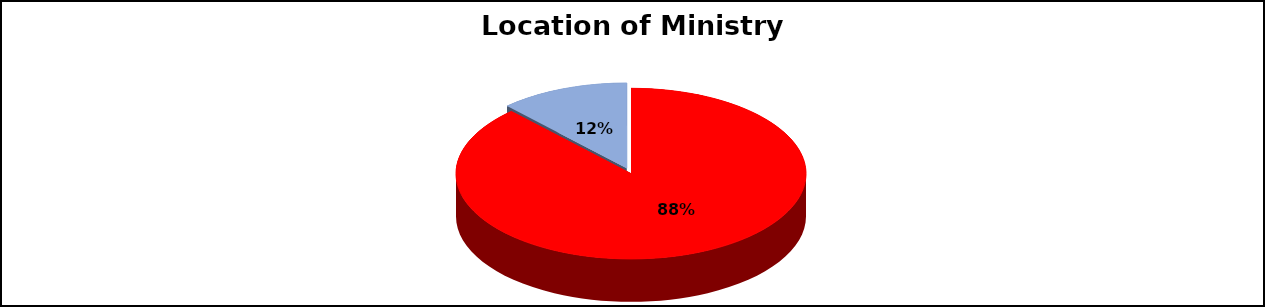
| Category | Series 0 |
|---|---|
| Budget Supporting Ministry Within WV Conference | 0.88 |
| Budget Supporting Ministry Outside WV Conference | 0.12 |